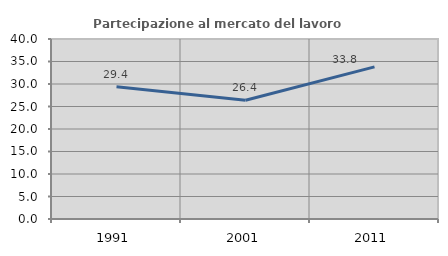
| Category | Partecipazione al mercato del lavoro  femminile |
|---|---|
| 1991.0 | 29.387 |
| 2001.0 | 26.394 |
| 2011.0 | 33.8 |